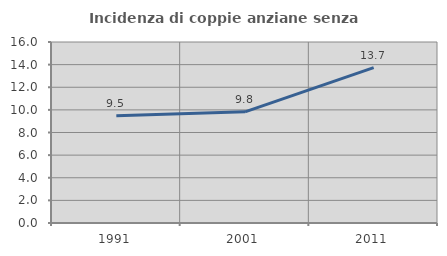
| Category | Incidenza di coppie anziane senza figli  |
|---|---|
| 1991.0 | 9.488 |
| 2001.0 | 9.826 |
| 2011.0 | 13.732 |